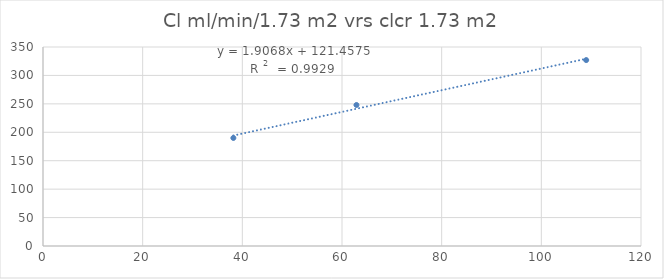
| Category | Series 0 |
|---|---|
| 109.0 | 327 |
| 62.9 | 248 |
| 38.2 | 190 |